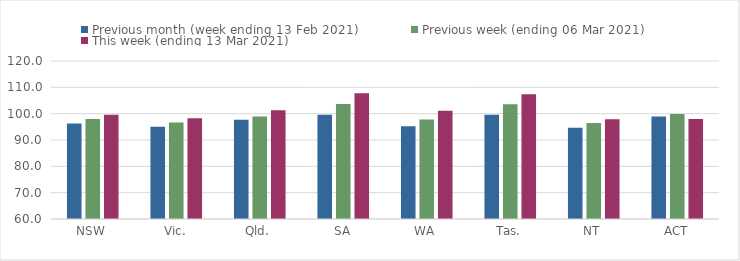
| Category | Previous month (week ending 13 Feb 2021) | Previous week (ending 06 Mar 2021) | This week (ending 13 Mar 2021) |
|---|---|---|---|
| NSW | 96.26 | 97.95 | 99.57 |
| Vic. | 95.03 | 96.65 | 98.25 |
| Qld. | 97.67 | 98.95 | 101.28 |
| SA | 99.59 | 103.65 | 107.72 |
| WA | 95.25 | 97.75 | 101.09 |
| Tas. | 99.61 | 103.62 | 107.35 |
| NT | 94.62 | 96.43 | 97.86 |
| ACT | 98.9 | 99.87 | 97.98 |